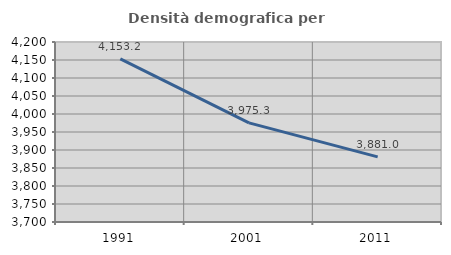
| Category | Densità demografica |
|---|---|
| 1991.0 | 4153.165 |
| 2001.0 | 3975.301 |
| 2011.0 | 3880.968 |